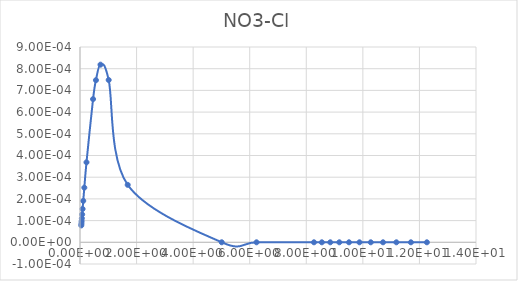
| Category | Series 0 |
|---|---|
| 0.045798 | 0 |
| 0.050886 | 0 |
| 0.057258 | 0 |
| 0.065456 | 0 |
| 0.076369 | 0 |
| 0.091683 | 0 |
| 0.11463 | 0 |
| 0.15298 | 0 |
| 0.2297 | 0 |
| 0.46159 | 0.001 |
| 0.56399 | 0.001 |
| 0.72477 | 0.001 |
| 1.0138 | 0.001 |
| 1.6863 | 0 |
| 5.0106 | 0 |
| 6.241 | 0 |
| 8.2722 | 0 |
| 8.5505 | 0 |
| 8.8482 | 0 |
| 9.1674 | 0 |
| 9.5104 | 0 |
| 9.8801 | 0 |
| 10.28 | 0 |
| 10.713 | 0 |
| 11.185 | 0 |
| 11.699 | 0 |
| 12.264 | 0 |